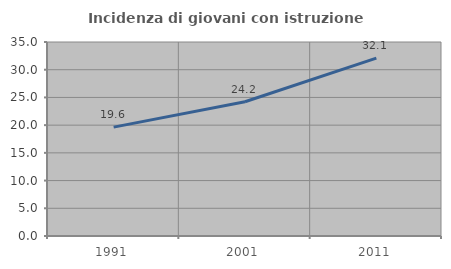
| Category | Incidenza di giovani con istruzione universitaria |
|---|---|
| 1991.0 | 19.645 |
| 2001.0 | 24.212 |
| 2011.0 | 32.094 |